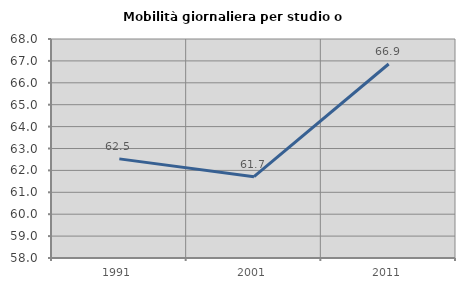
| Category | Mobilità giornaliera per studio o lavoro |
|---|---|
| 1991.0 | 62.526 |
| 2001.0 | 61.714 |
| 2011.0 | 66.858 |